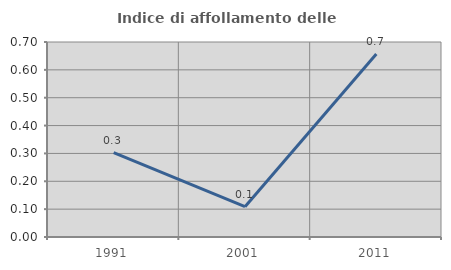
| Category | Indice di affollamento delle abitazioni  |
|---|---|
| 1991.0 | 0.303 |
| 2001.0 | 0.109 |
| 2011.0 | 0.657 |